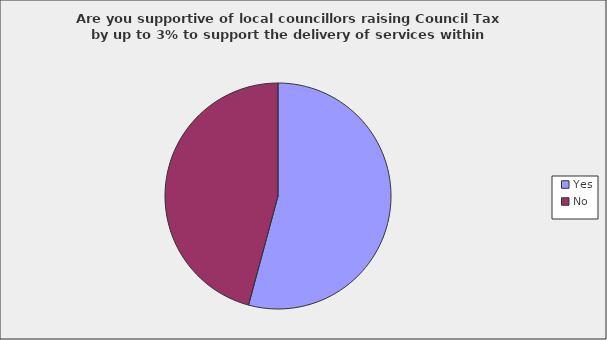
| Category | Series 0 |
|---|---|
| Yes | 0.542 |
| No | 0.458 |